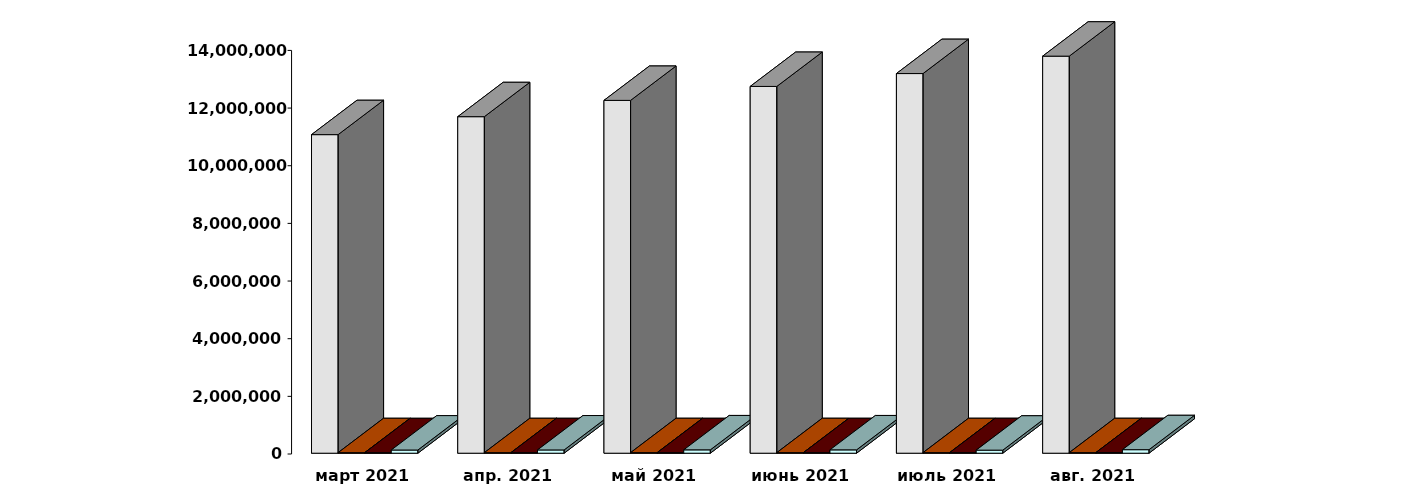
| Category | Физические лица | Юридические лица | Иностранные лица | Клиенты, передавшие свои средства в ДУ |
|---|---|---|---|---|
| 2021-03-30 | 11050505 | 19312 | 17990 | 110250 |
| 2021-04-30 | 11673527 | 19474 | 18437 | 113270 |
| 2021-05-30 | 12238639 | 19619 | 18804 | 116061 |
| 2021-06-30 | 12722884 | 19751 | 19280 | 115649 |
| 2021-07-31 | 13169586 | 19875 | 19720 | 105728 |
| 2021-08-31 | 13773190 | 19995 | 20283 | 122307 |